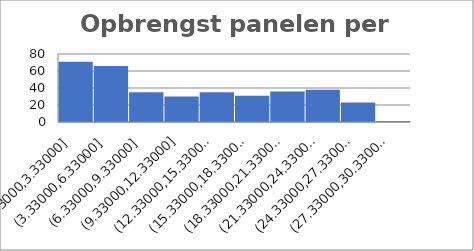
| Category | kWh |
|---|---|
| 1/31/20 | 3.918 |
| 1/30/20 | 4.28 |
| 1/29/20 | 3.165 |
| 1/28/20 | 3.985 |
| 1/27/20 | 1.144 |
| 1/26/20 | 7.636 |
| 1/25/20 | 1.151 |
| 1/24/20 | 1.671 |
| 1/23/20 | 0.943 |
| 1/22/20 | 2.507 |
| 1/21/20 | 9.735 |
| 1/20/20 | 5.263 |
| 1/19/20 | 2.815 |
| 1/18/20 | 3.62 |
| 1/17/20 | 0.854 |
| 1/16/20 | 8.585 |
| 1/15/20 | 4.711 |
| 1/14/20 | 1.353 |
| 1/13/20 | 3.827 |
| 1/12/20 | 1.259 |
| 1/11/20 | 3.759 |
| 1/10/20 | 0.866 |
| 1/9/20 | 0.963 |
| 1/8/20 | 1.259 |
| 1/7/20 | 3.379 |
| 1/6/20 | 7.079 |
| 1/5/20 | 0.85 |
| 1/4/20 | 2.192 |
| 1/3/20 | 0.68 |
| 1/2/20 | 2.039 |
| 1/1/20 | 6.2 |
| 2/29/20 | 6.112 |
| 2/28/20 | 5.248 |
| 2/27/20 | 1.227 |
| 2/26/20 | 2.764 |
| 2/25/20 | 8.596 |
| 2/24/20 | 2.315 |
| 2/23/20 | 0.618 |
| 2/22/20 | 2.495 |
| 2/21/20 | 7.095 |
| 2/20/20 | 3.998 |
| 2/19/20 | 5.461 |
| 2/18/20 | 3.9 |
| 2/17/20 | 7.891 |
| 2/16/20 | 5.67 |
| 2/15/20 | 9.714 |
| 2/14/20 | 3.613 |
| 2/13/20 | 4.961 |
| 2/12/20 | 7.758 |
| 2/11/20 | 4.939 |
| 2/10/20 | 3.77 |
| 2/9/20 | 4.044 |
| 2/8/20 | 3.903 |
| 2/7/20 | 12.709 |
| 2/6/20 | 4.309 |
| 2/5/20 | 7.131 |
| 2/4/20 | 3.192 |
| 2/3/20 | 2.988 |
| 2/2/20 | 1.108 |
| 2/1/20 | 0.982 |
| 3/31/20 | 21.812 |
| 3/30/20 | 15.196 |
| 3/29/20 | 6.423 |
| 3/28/20 | 19.884 |
| 3/27/20 | 19.518 |
| 3/26/20 | 21.541 |
| 3/25/20 | 21.057 |
| 3/24/20 | 22.208 |
| 3/23/20 | 22.14 |
| 3/22/20 | 22.556 |
| 3/21/20 | 14.341 |
| 3/20/20 | 2.472 |
| 3/19/20 | 9.207 |
| 3/18/20 | 18.819 |
| 3/17/20 | 20.28 |
| 3/16/20 | 13.471 |
| 3/15/20 | 11.282 |
| 3/14/20 | 11.927 |
| 3/13/20 | 6.66 |
| 3/12/20 | 18.206 |
| 3/11/20 | 4.555 |
| 3/10/20 | 2.414 |
| 3/9/20 | 9.332 |
| 3/8/20 | 6.024 |
| 3/7/20 | 13.148 |
| 3/6/20 | 1.741 |
| 3/5/20 | 2.271 |
| 3/4/20 | 9.865 |
| 3/3/20 | 10.095 |
| 3/2/20 | 3.89 |
| 3/1/20 | 6.227 |
| 4/30/20 | 15.325 |
| 4/29/20 | 11.834 |
| 4/28/20 | 8.058 |
| 4/27/20 | 22.431 |
| 4/26/20 | 24.439 |
| 4/25/20 | 23.755 |
| 4/24/20 | 22.359 |
| 4/23/20 | 23.381 |
| 4/22/20 | 24.903 |
| 4/21/20 | 25.008 |
| 4/20/20 | 25.072 |
| 4/19/20 | 6.01 |
| 4/18/20 | 11.584 |
| 4/17/20 | 21.679 |
| 4/16/20 | 21.931 |
| 4/15/20 | 23.206 |
| 4/14/20 | 15.846 |
| 4/13/20 | 18.725 |
| 4/12/20 | 19.529 |
| 4/11/20 | 21.32 |
| 4/10/20 | 22.302 |
| 4/9/20 | 21.171 |
| 4/8/20 | 17.497 |
| 4/7/20 | 20.944 |
| 4/6/20 | 21.83 |
| 4/5/20 | 22.751 |
| 4/4/20 | 22.724 |
| 4/3/20 | 10.162 |
| 4/2/20 | 16.482 |
| 4/1/20 | 22.311 |
| 5/31/20 | 26.214 |
| 5/30/20 | 24.962 |
| 5/29/20 | 26.479 |
| 5/28/20 | 27.02 |
| 5/27/20 | 21.422 |
| 5/26/20 | 26.831 |
| 5/25/20 | 19.982 |
| 5/24/20 | 12.63 |
| 5/23/20 | 17.626 |
| 5/22/20 | 10.559 |
| 5/21/20 | 24.598 |
| 5/20/20 | 20.142 |
| 5/19/20 | 22.687 |
| 5/18/20 | 25.621 |
| 5/17/20 | 24.536 |
| 5/16/20 | 22.232 |
| 5/15/20 | 26.708 |
| 5/14/20 | 24.942 |
| 5/13/20 | 13.084 |
| 5/12/20 | 20.213 |
| 5/11/20 | 19.228 |
| 5/10/20 | 8.288 |
| 5/9/20 | 21.897 |
| 5/8/20 | 19.079 |
| 5/7/20 | 22.433 |
| 5/6/20 | 26.179 |
| 5/5/20 | 27.459 |
| 5/4/20 | 15.654 |
| 5/3/20 | 16.17 |
| 5/2/20 | 14.979 |
| 5/1/20 | 17.684 |
| 6/30/20 | 12.853 |
| 6/29/20 | 22.721 |
| 6/28/20 | 16.746 |
| 6/27/20 | 19.126 |
| 6/26/20 | 18.453 |
| 6/25/20 | 25.574 |
| 6/24/20 | 25.87 |
| 6/23/20 | 25.777 |
| 6/22/20 | 22.826 |
| 6/21/20 | 18.667 |
| 6/20/20 | 26.149 |
| 6/19/20 | 24.693 |
| 6/18/20 | 21.272 |
| 6/17/20 | 15.187 |
| 6/16/20 | 12.213 |
| 6/15/20 | 17.195 |
| 6/14/20 | 7.869 |
| 6/13/20 | 20.123 |
| 6/12/20 | 16.996 |
| 6/11/20 | 13.676 |
| 6/10/20 | 10.437 |
| 6/9/20 | 7.476 |
| 6/8/20 | 16.362 |
| 6/7/20 | 14.432 |
| 6/6/20 | 20.874 |
| 6/5/20 | 8.811 |
| 6/4/20 | 3.351 |
| 6/3/20 | 20.288 |
| 6/2/20 | 24.082 |
| 6/1/20 | 25.052 |
| 7/31/20 | 23.421 |
| 7/30/20 | 24.025 |
| 7/29/20 | 20.635 |
| 7/28/20 | 19.533 |
| 7/27/20 | 15.926 |
| 7/26/20 | 18.542 |
| 7/25/20 | 10.027 |
| 7/24/20 | 16.546 |
| 7/23/20 | 23.21 |
| 7/22/20 | 23.872 |
| 7/21/20 | 25.78 |
| 7/20/20 | 15.833 |
| 7/19/20 | 23.579 |
| 7/18/20 | 23.922 |
| 7/17/20 | 11.8 |
| 7/16/20 | 6.088 |
| 7/15/20 | 18.656 |
| 7/14/20 | 12.249 |
| 7/13/20 | 25.41 |
| 7/12/20 | 22.707 |
| 7/11/20 | 17.01 |
| 7/10/20 | 13.51 |
| 7/9/20 | 14.691 |
| 7/8/20 | 6.097 |
| 7/7/20 | 15.024 |
| 7/6/20 | 16.602 |
| 7/5/20 | 11.521 |
| 7/4/20 | 13.761 |
| 7/3/20 | 17.18 |
| 7/2/20 | 15.738 |
| 7/1/20 | 10.959 |
| 8/31/20 | 8.646 |
| 8/30/20 | 13.257 |
| 8/29/20 | 14.414 |
| 8/28/20 | 14.317 |
| 8/27/20 | 18.473 |
| 8/26/20 | 5.107 |
| 8/25/20 | 8.329 |
| 8/24/20 | 13.434 |
| 8/23/20 | 11.854 |
| 8/22/20 | 13.34 |
| 8/21/20 | 13.002 |
| 8/20/20 | 14.181 |
| 8/19/20 | 16.744 |
| 8/18/20 | 15.101 |
| 8/17/20 | 14.71 |
| 8/16/20 | 12.375 |
| 8/15/20 | 9.391 |
| 8/14/20 | 18.723 |
| 8/13/20 | 19.081 |
| 8/12/20 | 14.683 |
| 8/11/20 | 12.905 |
| 8/10/20 | 18.009 |
| 8/9/20 | 9.572 |
| 8/8/20 | 21.5 |
| 8/7/20 | 22.44 |
| 8/6/20 | 22.463 |
| 8/5/20 | 23.948 |
| 8/4/20 | 21.897 |
| 8/3/20 | 21.343 |
| 8/2/20 | 13.575 |
| 8/1/20 | 19.658 |
| 9/30/20 | 5.463 |
| 9/29/20 | 12.848 |
| 9/28/20 | 2.133 |
| 9/27/20 | 5.484 |
| 9/26/20 | 3.672 |
| 9/25/20 | 7.966 |
| 9/24/20 | 13.124 |
| 9/23/20 | 10.516 |
| 9/22/20 | 16.921 |
| 9/21/20 | 17.668 |
| 9/20/20 | 16.188 |
| 9/19/20 | 17.254 |
| 9/18/20 | 18.569 |
| 9/17/20 | 19.037 |
| 9/16/20 | 15.823 |
| 9/15/20 | 17.212 |
| 9/14/20 | 17.588 |
| 9/13/20 | 18.859 |
| 9/12/20 | 18.846 |
| 9/11/20 | 16.807 |
| 9/10/20 | 20.831 |
| 9/9/20 | 13.717 |
| 9/8/20 | 14.279 |
| 9/7/20 | 20.446 |
| 9/6/20 | 17.367 |
| 9/5/20 | 13.957 |
| 9/4/20 | 3.301 |
| 9/3/20 | 5.209 |
| 9/2/20 | 18.195 |
| 9/1/20 | 9.613 |
| 10/31/20 | 10.972 |
| 10/30/20 | 2.972 |
| 10/29/20 | 2.63 |
| 10/28/20 | 7.001 |
| 10/27/20 | 5.329 |
| 10/26/20 | 4.925 |
| 10/25/20 | 1.402 |
| 10/24/20 | 3.699 |
| 10/23/20 | 3.776 |
| 10/22/20 | 6.52 |
| 10/21/20 | 7.98 |
| 10/20/20 | 1.927 |
| 10/19/20 | 11.233 |
| 10/18/20 | 4.561 |
| 10/17/20 | 4.674 |
| 10/16/20 | 2.173 |
| 10/15/20 | 2.139 |
| 10/14/20 | 4.62 |
| 10/13/20 | 7.17 |
| 10/12/20 | 8.048 |
| 10/11/20 | 8.774 |
| 10/10/20 | 9.146 |
| 10/9/20 | 6.314 |
| 10/8/20 | 4.147 |
| 10/7/20 | 5.933 |
| 10/6/20 | 6.403 |
| 10/5/20 | 5.244 |
| 10/4/20 | 8.284 |
| 10/3/20 | 2.502 |
| 10/2/20 | 3.739 |
| 10/1/20 | 3.737 |
| 11/30/20 | 3.423 |
| 11/29/20 | 7.234 |
| 11/28/20 | 5.462 |
| 11/27/20 | 6.131 |
| 11/26/20 | 3.069 |
| 11/25/20 | 4.722 |
| 11/24/20 | 7.494 |
| 11/23/20 | 6.387 |
| 11/22/20 | 0.787 |
| 11/21/20 | 5.382 |
| 11/20/20 | 6.691 |
| 11/19/20 | 1.22 |
| 11/18/20 | 9.817 |
| 11/17/20 | 2.068 |
| 11/16/20 | 1.921 |
| 11/15/20 | 3.085 |
| 11/14/20 | 7.531 |
| 11/13/20 | 3.414 |
| 11/12/20 | 4.976 |
| 11/11/20 | 6.275 |
| 11/10/20 | 8.966 |
| 11/9/20 | 3.748 |
| 11/8/20 | 2.065 |
| 11/7/20 | 9.85 |
| 11/6/20 | 11.994 |
| 11/5/20 | 11.606 |
| 11/4/20 | 10.097 |
| 11/3/20 | 7.96 |
| 11/2/20 | 3.511 |
| 11/1/20 | 2.793 |
| 12/31/20 | 0.817 |
| 12/30/20 | 0.817 |
| 12/29/20 | 2.217 |
| 12/28/20 | 2.155 |
| 12/27/20 | 0.385 |
| 12/26/20 | 2.987 |
| 12/25/20 | 2.845 |
| 12/24/20 | 0.349 |
| 12/23/20 | 0.33 |
| 12/22/20 | 0.716 |
| 12/21/20 | 0.641 |
| 12/20/20 | 2.275 |
| 12/19/20 | 2.726 |
| 12/18/20 | 5.668 |
| 12/17/20 | 4.22 |
| 12/16/20 | 3.485 |
| 12/15/20 | 0.565 |
| 12/14/20 | 1.822 |
| 12/13/20 | 4.072 |
| 12/12/20 | 0.952 |
| 12/11/20 | 1.099 |
| 12/10/20 | 1.19 |
| 12/9/20 | 6.211 |
| 12/8/20 | 2.341 |
| 12/7/20 | 1.392 |
| 12/6/20 | 1.328 |
| 12/5/20 | 4.895 |
| 12/4/20 | 3.486 |
| 12/3/20 | 1.317 |
| 12/2/20 | 0.763 |
| 12/1/20 | 0.576 |